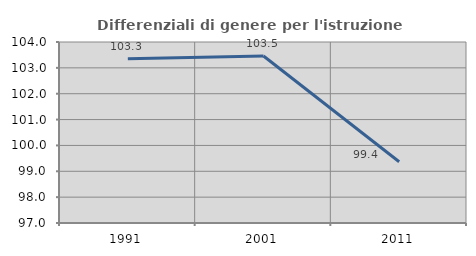
| Category | Differenziali di genere per l'istruzione superiore |
|---|---|
| 1991.0 | 103.348 |
| 2001.0 | 103.46 |
| 2011.0 | 99.367 |